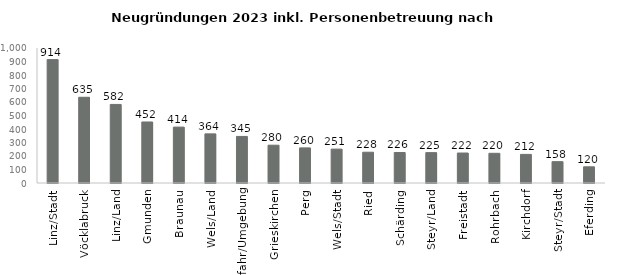
| Category | Series 1 |
|---|---|
| Linz/Stadt | 914 |
| Vöcklabruck | 635 |
| Linz/Land | 582 |
| Gmunden | 452 |
| Braunau | 414 |
| Wels/Land | 364 |
| Urfahr/Umgebung | 345 |
| Grieskirchen | 280 |
| Perg | 260 |
| Wels/Stadt | 251 |
| Ried | 228 |
| Schärding | 226 |
| Steyr/Land | 225 |
| Freistadt | 222 |
| Rohrbach | 220 |
| Kirchdorf | 212 |
| Steyr/Stadt | 158 |
| Eferding | 120 |